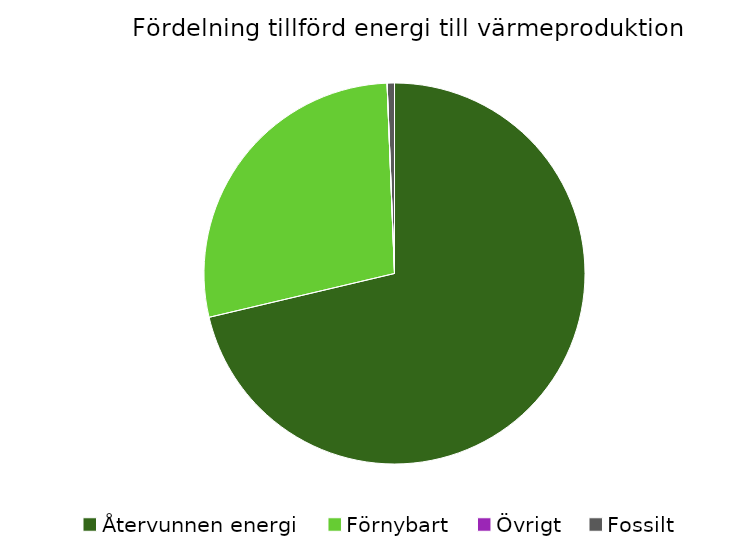
| Category | Fördelning värmeproduktion |
|---|---|
| Återvunnen energi | 0.713 |
| Förnybart | 0.281 |
| Övrigt | 0 |
| Fossilt | 0.006 |